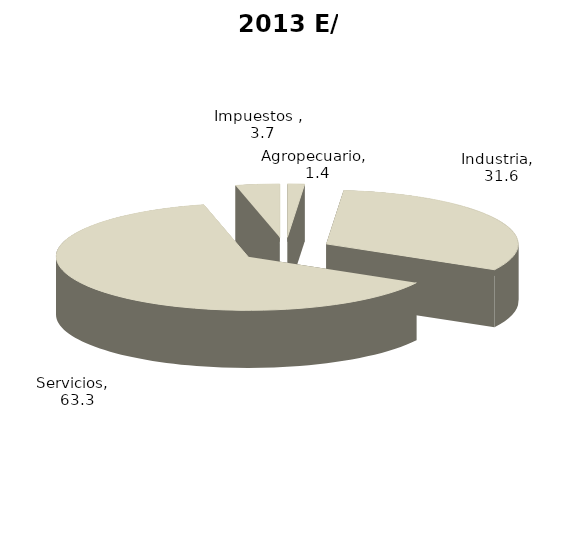
| Category | 2013 E/ |
|---|---|
| Agropecuario | 1.436 |
| Industria | 31.59 |
| Servicios | 63.274 |
| Impuestos  | 3.7 |